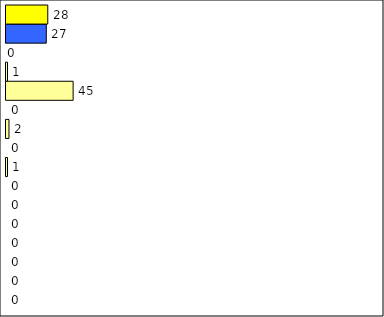
| Category | -2 | -1 | 0 | 1 | 2 | 3 | 4 | 5 | 6 | 7 | 8 | 9 | 10 | 11 | 12 | Perfect Round |
|---|---|---|---|---|---|---|---|---|---|---|---|---|---|---|---|---|
| 0 | 0 | 0 | 0 | 0 | 0 | 0 | 0 | 1 | 0 | 2 | 0 | 45 | 1 | 0 | 27 | 28 |